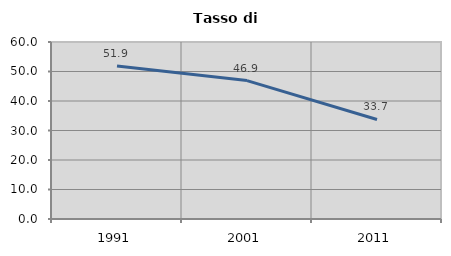
| Category | Tasso di disoccupazione   |
|---|---|
| 1991.0 | 51.881 |
| 2001.0 | 46.914 |
| 2011.0 | 33.736 |